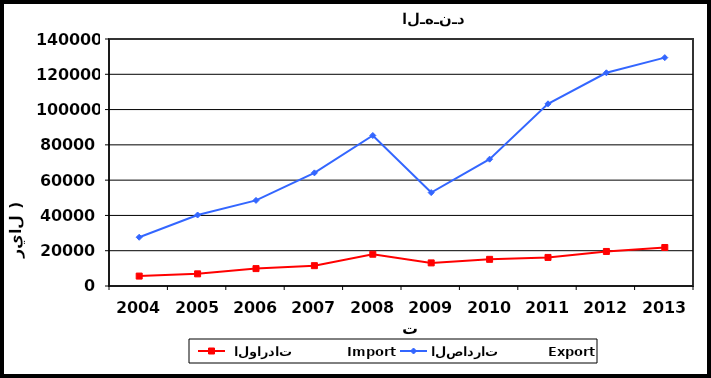
| Category |  الواردات           Import | الصادرات          Export |
|---|---|---|
| 2004.0 | 5622 | 27625 |
| 2005.0 | 6884 | 40237 |
| 2006.0 | 9864 | 48520 |
| 2007.0 | 11529 | 64120 |
| 2008.0 | 18012 | 85295 |
| 2009.0 | 13095 | 52951 |
| 2010.0 | 15116 | 71891 |
| 2011.0 | 16191 | 103272 |
| 2012.0 | 19581 | 120841 |
| 2013.0 | 21822 | 129444 |